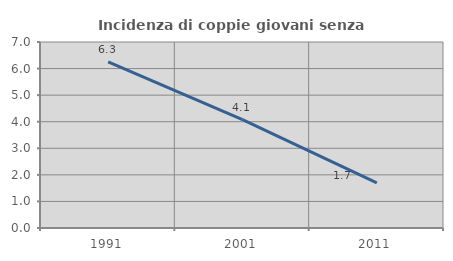
| Category | Incidenza di coppie giovani senza figli |
|---|---|
| 1991.0 | 6.25 |
| 2001.0 | 4.082 |
| 2011.0 | 1.695 |